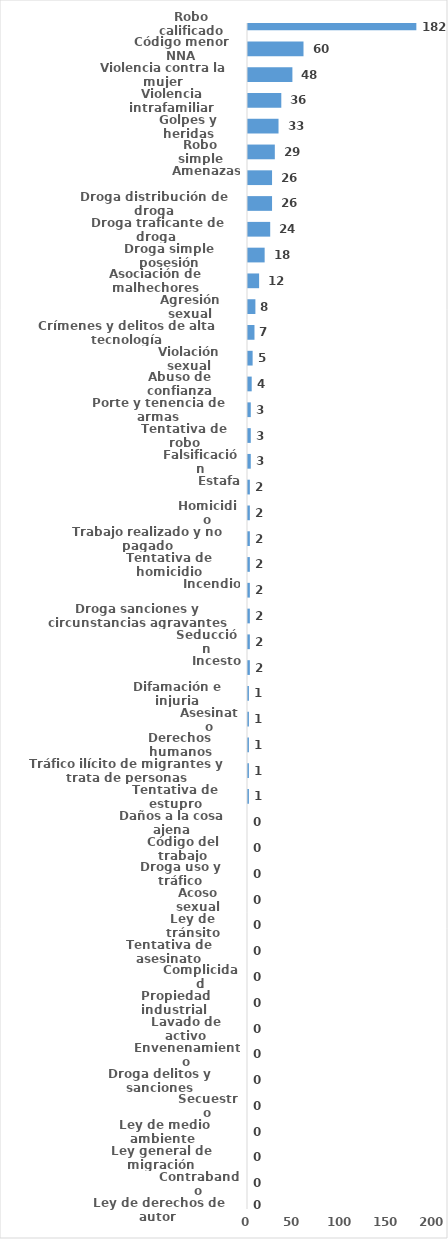
| Category | Series 0 |
|---|---|
| Robo calificado | 182 |
| Código menor NNA | 60 |
| Violencia contra la mujer | 48 |
| Violencia intrafamiliar | 36 |
| Golpes y heridas | 33 |
| Robo simple | 29 |
| Amenazas | 26 |
| Droga distribución de droga | 26 |
| Droga traficante de droga  | 24 |
| Droga simple posesión | 18 |
| Asociación de malhechores | 12 |
| Agresión sexual | 8 |
| Crímenes y delitos de alta tecnología | 7 |
| Violación sexual | 5 |
| Abuso de confianza | 4 |
| Porte y tenencia de armas | 3 |
| Tentativa de robo | 3 |
| Falsificación | 3 |
| Estafa | 2 |
| Homicidio | 2 |
| Trabajo realizado y no pagado | 2 |
| Tentativa de homicidio | 2 |
| Incendio | 2 |
| Droga sanciones y circunstancias agravantes | 2 |
| Seducción | 2 |
| Incesto | 2 |
| Difamación e injuria | 1 |
| Asesinato | 1 |
| Derechos humanos | 1 |
| Tráfico ilícito de migrantes y trata de personas | 1 |
| Tentativa de estupro | 1 |
| Daños a la cosa ajena | 0 |
| Código del trabajo | 0 |
| Droga uso y tráfico | 0 |
| Acoso sexual | 0 |
| Ley de tránsito | 0 |
| Tentativa de asesinato | 0 |
| Complicidad | 0 |
| Propiedad industrial  | 0 |
| Lavado de activo | 0 |
| Envenenamiento | 0 |
| Droga delitos y sanciones | 0 |
| Secuestro | 0 |
| Ley de medio ambiente  | 0 |
| Ley general de migración | 0 |
| Contrabando | 0 |
| Ley de derechos de autor  | 0 |